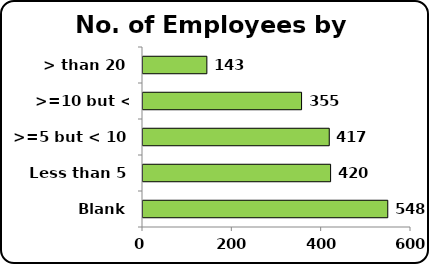
| Category | No. of Employees |
|---|---|
| Blank | 548 |
| Less than 5 | 420 |
| >=5 but < 10 | 417 |
| >=10 but < 20 | 355 |
| > than 20 | 143 |